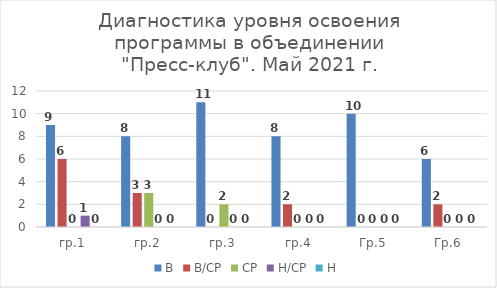
| Category | В | В/СР | СР | Н/СР | Н |
|---|---|---|---|---|---|
| гр.1 | 9 | 6 | 0 | 1 | 0 |
| гр.2 | 8 | 3 | 3 | 0 | 0 |
| гр.3 | 11 | 0 | 2 | 0 | 0 |
| гр.4 | 8 | 2 | 0 | 0 | 0 |
| Гр.5 | 10 | 0 | 0 | 0 | 0 |
| Гр.6 | 6 | 2 | 0 | 0 | 0 |